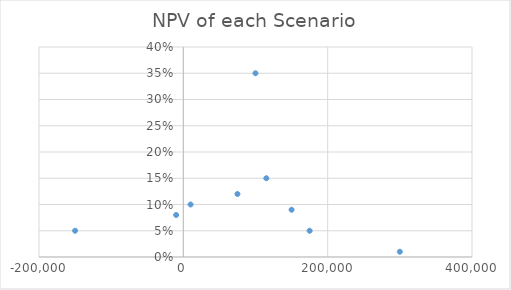
| Category | Series 0 |
|---|---|
| -150000.0 | 0.05 |
| -10000.0 | 0.08 |
| 10000.0 | 0.1 |
| 75000.0 | 0.12 |
| 100000.0 | 0.35 |
| 115000.0 | 0.15 |
| 150000.0 | 0.09 |
| 175000.0 | 0.05 |
| 300000.0 | 0.01 |